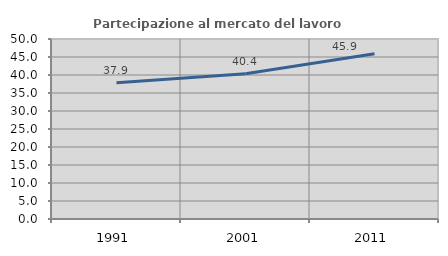
| Category | Partecipazione al mercato del lavoro  femminile |
|---|---|
| 1991.0 | 37.879 |
| 2001.0 | 40.353 |
| 2011.0 | 45.873 |